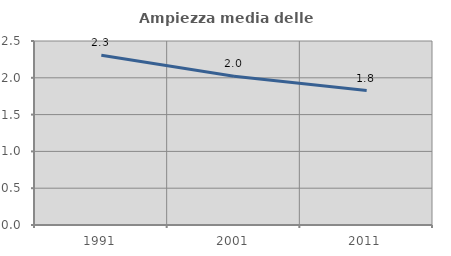
| Category | Ampiezza media delle famiglie |
|---|---|
| 1991.0 | 2.306 |
| 2001.0 | 2.021 |
| 2011.0 | 1.826 |